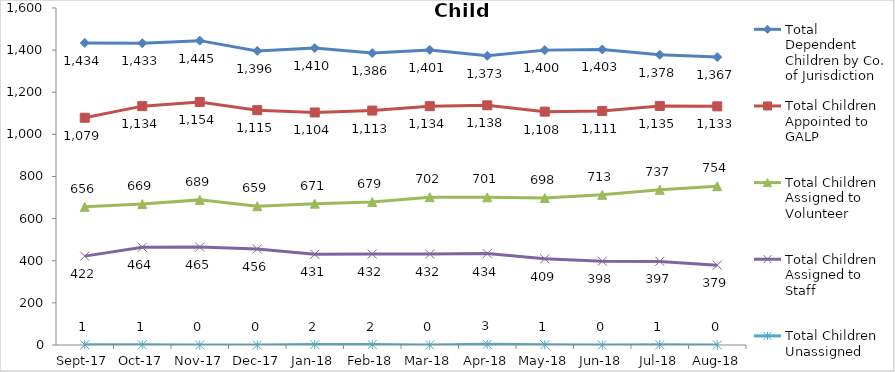
| Category | Total Dependent Children by Co. of Jurisdiction | Total Children Appointed to GALP | Total Children Assigned to Volunteer | Total Children Assigned to Staff | Total Children Unassigned |
|---|---|---|---|---|---|
| 2017-09-01 | 1434 | 1079 | 656 | 422 | 1 |
| 2017-10-01 | 1433 | 1134 | 669 | 464 | 1 |
| 2017-11-01 | 1445 | 1154 | 689 | 465 | 0 |
| 2017-12-01 | 1396 | 1115 | 659 | 456 | 0 |
| 2018-01-01 | 1410 | 1104 | 671 | 431 | 2 |
| 2018-02-01 | 1386 | 1113 | 679 | 432 | 2 |
| 2018-03-01 | 1401 | 1134 | 702 | 432 | 0 |
| 2018-04-01 | 1373 | 1138 | 701 | 434 | 3 |
| 2018-05-01 | 1400 | 1108 | 698 | 409 | 1 |
| 2018-06-01 | 1403 | 1111 | 713 | 398 | 0 |
| 2018-07-01 | 1378 | 1135 | 737 | 397 | 1 |
| 2018-08-01 | 1367 | 1133 | 754 | 379 | 0 |